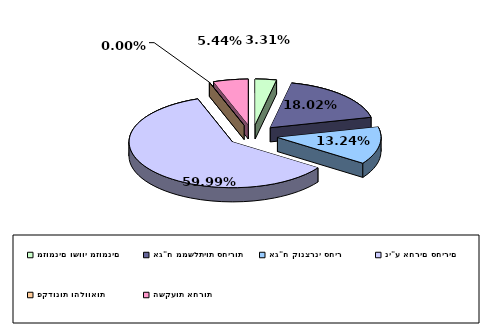
| Category | Series 0 |
|---|---|
| מזומנים ושווי מזומנים | 0.033 |
| אג"ח ממשלתיות סחירות | 0.18 |
| אג"ח קונצרני סחיר | 0.132 |
| ני"ע אחרים סחירים | 0.6 |
| פקדונות והלוואות | 0 |
| השקעות אחרות | 0.054 |